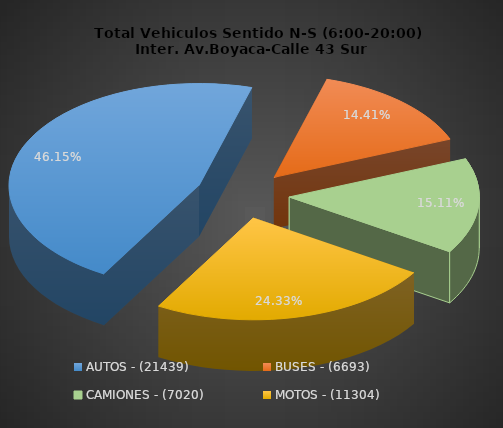
| Category | PORCENTAJE |
|---|---|
| AUTOS - (21439) | 46.149 |
| BUSES - (6693) | 14.407 |
| CAMIONES - (7020) | 15.111 |
| MOTOS - (11304) | 24.333 |